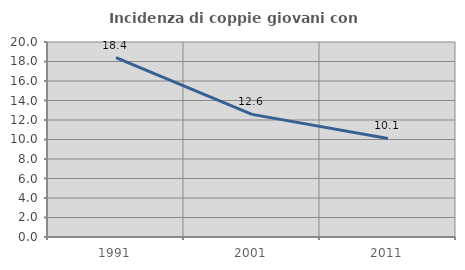
| Category | Incidenza di coppie giovani con figli |
|---|---|
| 1991.0 | 18.398 |
| 2001.0 | 12.577 |
| 2011.0 | 10.106 |